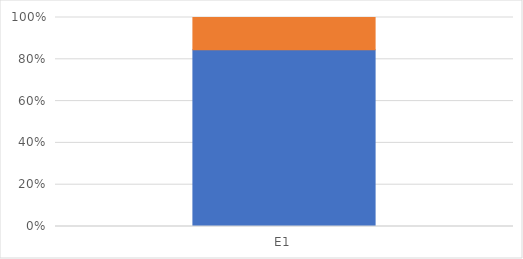
| Category | melobesioids | mastophoroids |
|---|---|---|
| E1 | 84.615 | 15.385 |